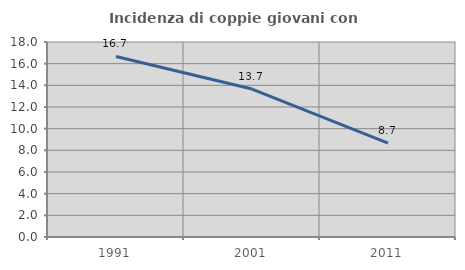
| Category | Incidenza di coppie giovani con figli |
|---|---|
| 1991.0 | 16.667 |
| 2001.0 | 13.659 |
| 2011.0 | 8.665 |